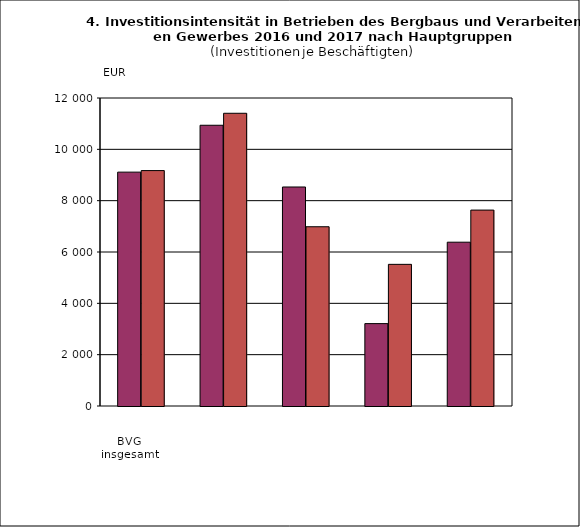
| Category | VJ | BJ |
|---|---|---|
| 0 | 9112 | 9172 |
| 1 | 10938 | 11405 |
| 2 | 8533 | 6984 |
| 3 | 3210 | 5519 |
| 4 | 6382 | 7633 |